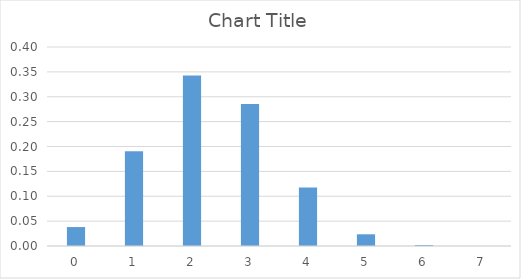
| Category | Series 0 |
|---|---|
| 0.0 | 0.038 |
| 1.0 | 0.19 |
| 2.0 | 0.343 |
| 3.0 | 0.286 |
| 4.0 | 0.118 |
| 5.0 | 0.024 |
| 6.0 | 0.002 |
| 7.0 | 0 |